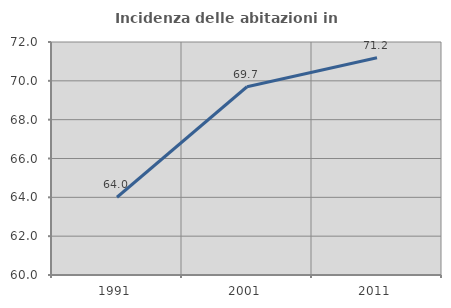
| Category | Incidenza delle abitazioni in proprietà  |
|---|---|
| 1991.0 | 64.004 |
| 2001.0 | 69.694 |
| 2011.0 | 71.19 |